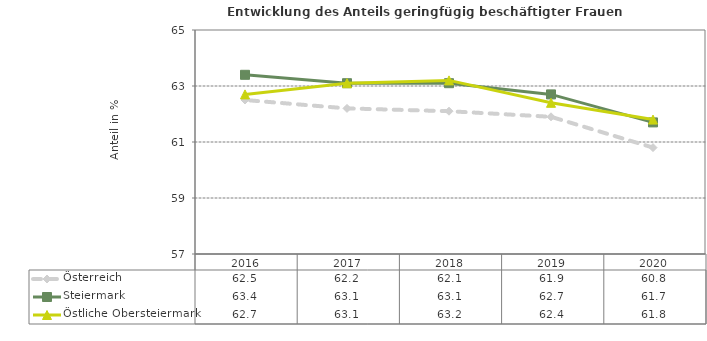
| Category | Österreich | Steiermark | Östliche Obersteiermark |
|---|---|---|---|
| 2020.0 | 60.8 | 61.7 | 61.8 |
| 2019.0 | 61.9 | 62.7 | 62.4 |
| 2018.0 | 62.1 | 63.1 | 63.2 |
| 2017.0 | 62.2 | 63.1 | 63.1 |
| 2016.0 | 62.5 | 63.4 | 62.7 |